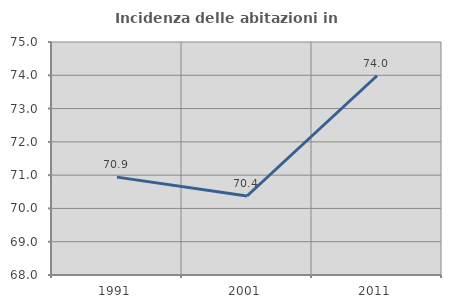
| Category | Incidenza delle abitazioni in proprietà  |
|---|---|
| 1991.0 | 70.941 |
| 2001.0 | 70.374 |
| 2011.0 | 73.986 |